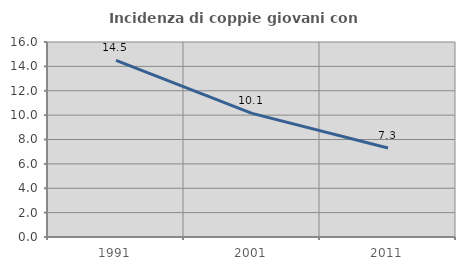
| Category | Incidenza di coppie giovani con figli |
|---|---|
| 1991.0 | 14.488 |
| 2001.0 | 10.145 |
| 2011.0 | 7.308 |